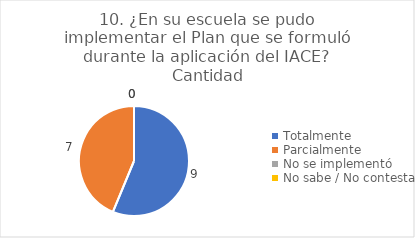
| Category | 10. ¿En su escuela se pudo implementar el Plan que se formuló durante la aplicación del IACE? |
|---|---|
| Totalmente  | 0.562 |
| Parcialmente  | 0.438 |
| No se implementó  | 0 |
| No sabe / No contesta | 0 |